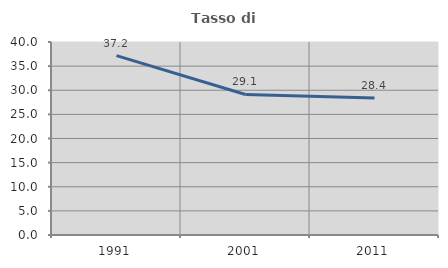
| Category | Tasso di occupazione   |
|---|---|
| 1991.0 | 37.164 |
| 2001.0 | 29.127 |
| 2011.0 | 28.385 |